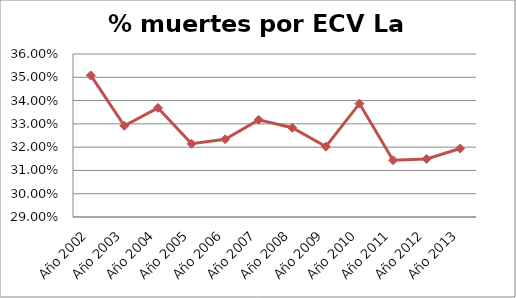
| Category | Series 0 |
|---|---|
| Año 2002 | 0.351 |
| Año 2003 | 0.329 |
| Año 2004 | 0.337 |
| Año 2005 | 0.321 |
| Año 2006 | 0.323 |
| Año 2007 | 0.332 |
| Año 2008 | 0.328 |
| Año 2009 | 0.32 |
| Año 2010 | 0.339 |
| Año 2011 | 0.314 |
| Año 2012 | 0.315 |
| Año 2013 | 0.319 |